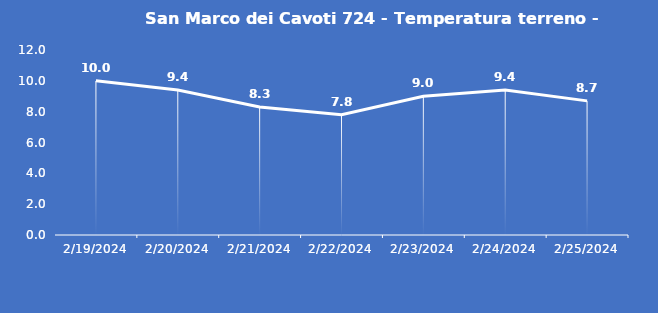
| Category | San Marco dei Cavoti 724 - Temperatura terreno - Grezzo (°C) |
|---|---|
| 2/19/24 | 10 |
| 2/20/24 | 9.4 |
| 2/21/24 | 8.3 |
| 2/22/24 | 7.8 |
| 2/23/24 | 9 |
| 2/24/24 | 9.4 |
| 2/25/24 | 8.7 |